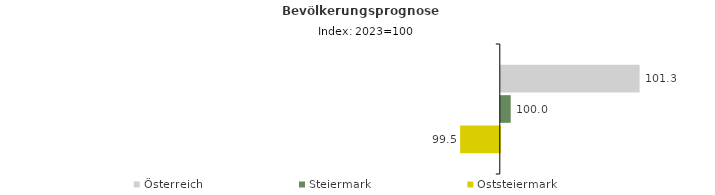
| Category | Österreich | Steiermark | Oststeiermark |
|---|---|---|---|
| 2023.0 | 101.3 | 100 | 99.5 |